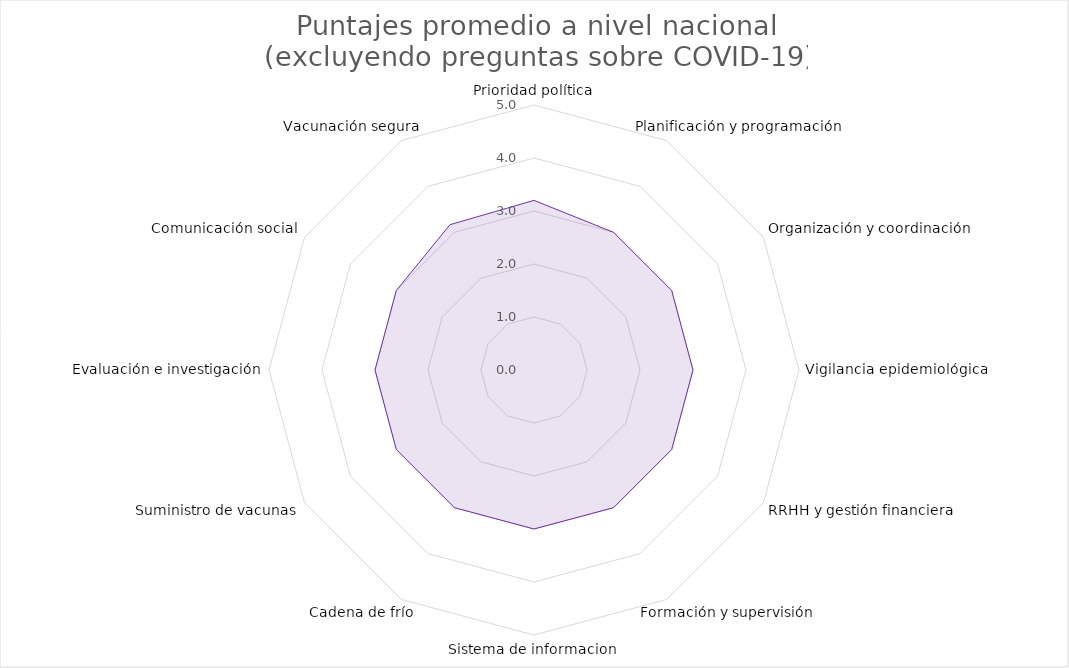
| Category | Puntajes promedio a nivel nacional 
(excluyendo preguntas sobre COVID-19) |
|---|---|
| Prioridad política | 3.2 |
| Planificación y programación | 3 |
| Organización y coordinación | 3 |
| Vigilancia epidemiológica | 3 |
| RRHH y gestión financiera | 3 |
| Formación y supervisión | 3 |
| Sistema de informacion | 3 |
| Cadena de frío | 3 |
| Suministro de vacunas | 3 |
| Evaluación e investigación | 3 |
| Comunicación social | 3 |
| Vacunación segura | 3.167 |